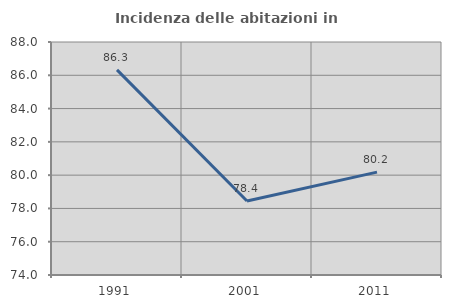
| Category | Incidenza delle abitazioni in proprietà  |
|---|---|
| 1991.0 | 86.325 |
| 2001.0 | 78.448 |
| 2011.0 | 80.18 |